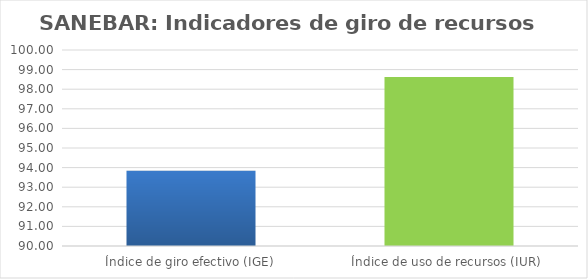
| Category | Series 0 |
|---|---|
| Índice de giro efectivo (IGE) | 93.842 |
| Índice de uso de recursos (IUR)  | 98.618 |